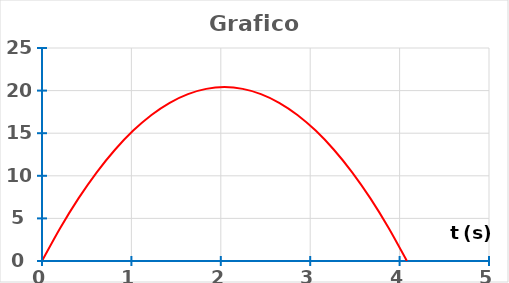
| Category | Series 0 |
|---|---|
| 0.0 | 0 |
| 0.20408163265306123 | 3.878 |
| 0.40816326530612246 | 7.347 |
| 0.6122448979591837 | 10.408 |
| 0.8163265306122449 | 13.061 |
| 1.0204081632653061 | 15.306 |
| 1.2244897959183674 | 17.143 |
| 1.4285714285714286 | 18.571 |
| 1.6326530612244898 | 19.592 |
| 1.836734693877551 | 20.204 |
| 2.0408163265306123 | 20.408 |
| 2.2448979591836737 | 20.204 |
| 2.4489795918367347 | 19.592 |
| 2.6530612244897958 | 18.571 |
| 2.8571428571428568 | 17.143 |
| 3.0612244897959178 | 15.306 |
| 3.2653061224489788 | 13.061 |
| 3.46938775510204 | 10.408 |
| 3.673469387755101 | 7.347 |
| 3.877551020408162 | 3.878 |
| 4.081632653061223 | 0 |